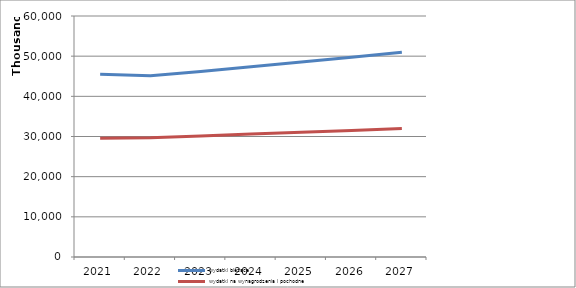
| Category | wydatki bieżące | wydatki na wynagrodzenia i pochodne |
|---|---|---|
| 2021.0 | 45477372 | 29583817 |
| 2022.0 | 45115561 | 29701929 |
| 2023.0 | 46198335 | 30147457 |
| 2024.0 | 47353293 | 30599669 |
| 2025.0 | 48537126 | 31058664 |
| 2026.0 | 49750554 | 31524544 |
| 2027.0 | 50994317 | 31997412 |